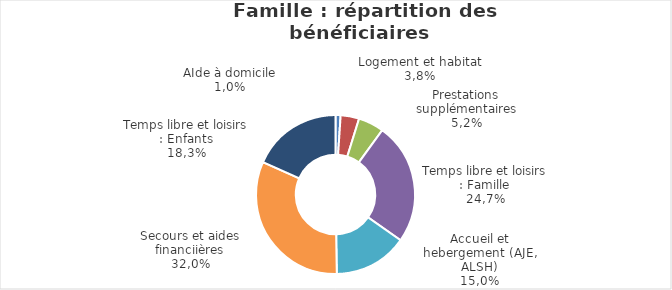
| Category | Series 0 |
|---|---|
| Aide à domicile | 1485 |
| Logement et habitat | 5400 |
| Prestations supplémentaires | 7477 |
| Temps libre et loisirs : Famille | 35487 |
| Accueil et hébergement (AJE, ALSH) | 21501 |
| Secours et aides financières | 45819 |
| Temps libre et loisirs : Enfants | 26273 |